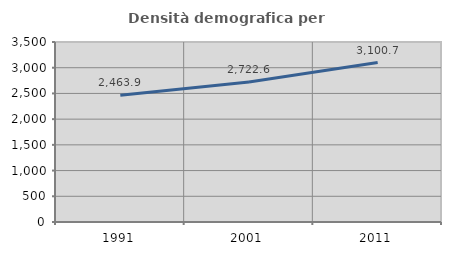
| Category | Densità demografica |
|---|---|
| 1991.0 | 2463.869 |
| 2001.0 | 2722.628 |
| 2011.0 | 3100.73 |